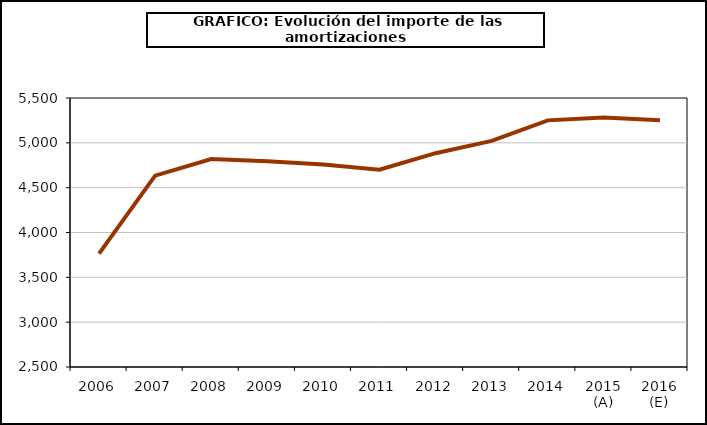
| Category | amortizacion |
|---|---|
| 2006 | 3764.885 |
| 2007 | 4634.4 |
| 2008 | 4820.083 |
| 2009 | 4794.062 |
| 2010 | 4758.255 |
| 2011 | 4699.859 |
| 2012 | 4884.543 |
| 2013 | 5021.523 |
| 2014 | 5250.601 |
| 2015 (A) | 5281.441 |
| 2016 (E) | 5251.53 |